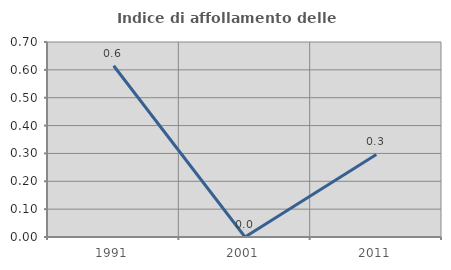
| Category | Indice di affollamento delle abitazioni  |
|---|---|
| 1991.0 | 0.615 |
| 2001.0 | 0 |
| 2011.0 | 0.296 |